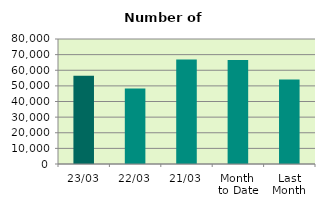
| Category | Series 0 |
|---|---|
| 23/03 | 56546 |
| 22/03 | 48252 |
| 21/03 | 66856 |
| Month 
to Date | 66630.235 |
| Last
Month | 54034.8 |